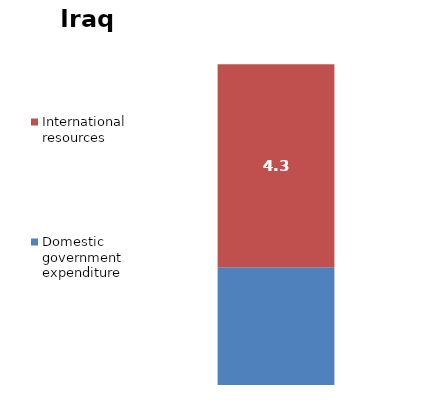
| Category | Domestic government expenditure | International resources |
|---|---|---|
| 0 | 93.517 | 4.346 |